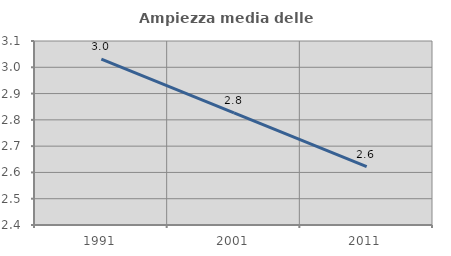
| Category | Ampiezza media delle famiglie |
|---|---|
| 1991.0 | 3.031 |
| 2001.0 | 2.826 |
| 2011.0 | 2.622 |